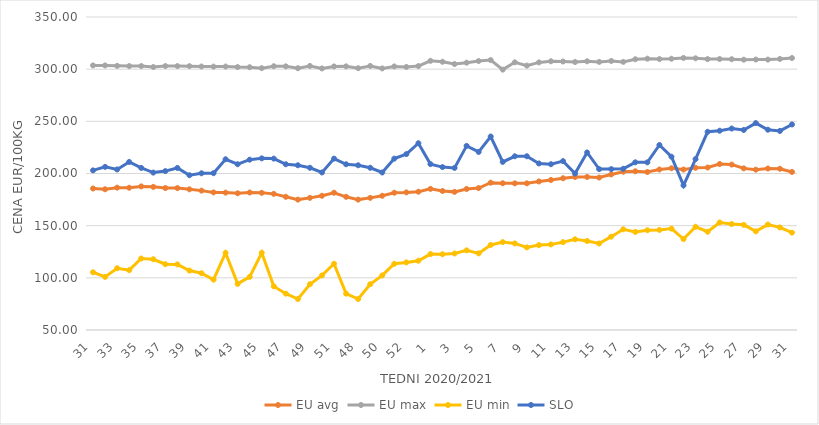
| Category | EU avg | EU max | EU min | SLO |
|---|---|---|---|---|
| 31.0 | 185.621 | 303.57 | 105.336 | 203 |
| 32.0 | 184.887 | 303.58 | 100.908 | 206.36 |
| 33.0 | 186.411 | 303.17 | 109.191 | 203.88 |
| 34.0 | 186.338 | 302.96 | 107.355 | 211.07 |
| 35.0 | 187.628 | 302.99 | 118.534 | 205.34 |
| 36.0 | 187.19 | 302.05 | 117.814 | 200.88 |
| 37.0 | 186.038 | 302.98 | 113.058 | 202.29 |
| 38.0 | 185.986 | 302.94 | 112.896 | 205.33 |
| 39.0 | 184.836 | 302.88 | 106.953 | 198.33 |
| 40.0 | 183.595 | 302.56 | 104.426 | 200.21 |
| 41.0 | 181.893 | 302.44 | 98.23 | 200.3 |
| 42.0 | 181.671 | 302.52 | 123.908 | 213.66 |
| 43.0 | 181.023 | 302.01 | 94.177 | 208.86 |
| 44.0 | 181.795 | 301.86 | 100.908 | 213.25 |
| 45.0 | 181.489 | 300.98 | 124 | 214.51 |
| 46.0 | 180.473 | 302.82 | 91.889 | 214.27 |
| 47.0 | 177.656 | 302.7 | 84.832 | 208.87 |
| 48.0 | 174.977 | 300.94 | 79.697 | 207.9 |
| 49.0 | 176.65 | 303.09 | 93.873 | 205.48 |
| 50.0 | 178.648 | 300.7 | 102.316 | 200.99 |
| 51.0 | 181.58 | 302.62 | 113.46 | 214.25 |
| 47.0 | 177.656 | 302.7 | 84.832 | 208.87 |
| 48.0 | 174.977 | 300.94 | 79.697 | 207.9 |
| 49.0 | 176.65 | 303.09 | 93.873 | 205.48 |
| 50.0 | 178.648 | 300.7 | 102.316 | 200.99 |
| 51.0 | 181.58 | 302.62 | 113.46 | 214.25 |
| 52.0 | 181.9 | 302.14 | 114.76 | 218.61 |
| 53.0 | 182.536 | 303 | 116.375 | 229 |
| 1.0 | 185.3 | 308 | 122.769 | 209 |
| 2.0 | 183.25 | 307.1 | 122.609 | 206.15 |
| 3.0 | 182.393 | 304.91 | 123.32 | 205.35 |
| 4.0 | 185.158 | 306.22 | 126.329 | 226.48 |
| 5.0 | 186.04 | 307.79 | 123.461 | 220.65 |
| 6.0 | 191.206 | 308.7 | 131.528 | 235.46 |
| 7.0 | 190.629 | 299.55 | 134.262 | 211.1 |
| 8.0 | 190.57 | 306.55 | 132.97 | 216.51 |
| 9.0 | 190.562 | 303.4 | 129.173 | 216.54 |
| 10.0 | 192.373 | 306.48 | 131.374 | 209.61 |
| 11.0 | 193.79 | 307.58 | 132.024 | 208.91 |
| 12.0 | 195.449 | 307.33 | 134.212 | 211.87 |
| 13.0 | 196.631 | 306.85 | 136.936 | 199.93 |
| 14.0 | 196.702 | 307.56 | 135.297 | 220.15 |
| 15.0 | 196.13 | 306.96 | 132.893 | 204.2 |
| 16.0 | 199.1 | 307.87 | 139.462 | 204.2 |
| 17.0 | 201.754 | 306.98 | 146.538 | 204.51 |
| 18.0 | 202.13 | 309.49 | 144.017 | 210.72 |
| 19.0 | 201.439 | 310.06 | 145.644 | 210.68 |
| 20.0 | 203.834 | 309.69 | 145.911 | 227.32 |
| 21.0 | 205.04 | 309.99 | 147.188 | 216.08 |
| 22.0 | 203.79 | 310.76 | 137.177 | 188.6 |
| 23.0 | 205.51 | 310.41 | 148.928 | 213.84 |
| 24.0 | 205.73 | 309.64 | 144.161 | 239.99 |
| 25.0 | 209.095 | 309.74 | 153.081 | 240.99 |
| 26.0 | 208.551 | 309.55 | 151.599 | 243.11 |
| 27.0 | 204.914 | 309.08 | 150.789 | 241.72 |
| 28.0 | 203.681 | 309.21 | 144.56 | 248.33 |
| 29.0 | 204.773 | 309.15 | 151.052 | 241.96 |
| 30.0 | 204.558 | 309.78 | 148.33 | 240.79 |
| 31.0 | 201.483 | 310.67 | 143.33 | 247 |